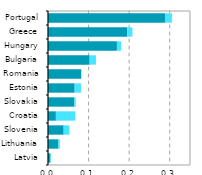
| Category |  ICT services  |   ICT manufacturing |
|---|---|---|
| Latvia | 0.005 | 0.002 |
| Lithuania | 0.025 | 0.004 |
| Slovenia | 0.039 | 0.014 |
| Croatia | 0.019 | 0.048 |
| Slovakia | 0.065 | 0.003 |
| Estonia | 0.066 | 0.016 |
| Romania | 0.082 | 0.001 |
| Bulgaria | 0.103 | 0.015 |
| Hungary | 0.17 | 0.011 |
| Greece | 0.195 | 0.013 |
| Portugal | 0.288 | 0.017 |